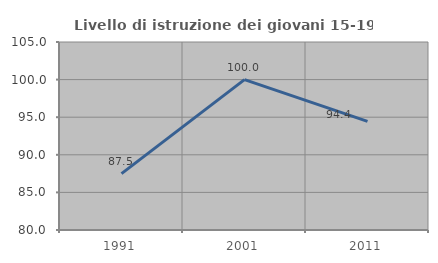
| Category | Livello di istruzione dei giovani 15-19 anni |
|---|---|
| 1991.0 | 87.5 |
| 2001.0 | 100 |
| 2011.0 | 94.444 |